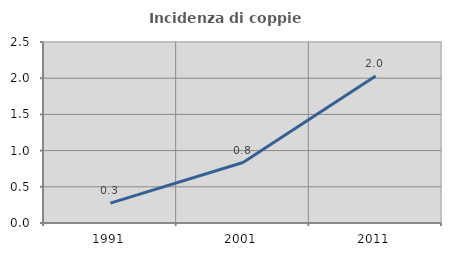
| Category | Incidenza di coppie miste |
|---|---|
| 1991.0 | 0.275 |
| 2001.0 | 0.835 |
| 2011.0 | 2.029 |